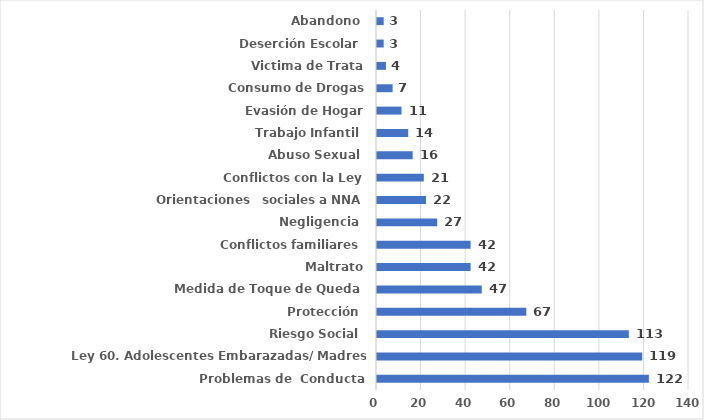
| Category | Series 0 |
|---|---|
| Problemas de  Conducta | 122 |
| Ley 60. Adolescentes Embarazadas/ Madres Adolescentes. | 119 |
| Riesgo Social  | 113 |
| Protección  | 67 |
| Medida de Toque de Queda  | 47 |
| Maltrato | 42 |
| Conflictos familiares  | 42 |
| Negligencia  | 27 |
| Orientaciones   sociales a NNA | 22 |
| Conflictos con la Ley | 21 |
| Abuso Sexual  | 16 |
| Trabajo Infantil  | 14 |
| Evasión de Hogar | 11 |
| Consumo de Drogas | 7 |
| Victima de Trata | 4 |
| Deserción Escolar  | 3 |
| Abandono  | 3 |